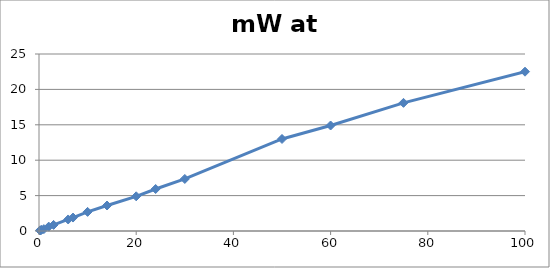
| Category | mW at sample |
|---|---|
| 0.2 | 0.077 |
| 0.3 | 0.103 |
| 0.5 | 0.155 |
| 1.0 | 0.266 |
| 2.0 | 0.614 |
| 3.0 | 0.86 |
| 6.0 | 1.63 |
| 7.0 | 1.9 |
| 10.0 | 2.7 |
| 14.0 | 3.6 |
| 20.0 | 4.9 |
| 24.0 | 5.93 |
| 30.0 | 7.35 |
| 50.0 | 13 |
| 60.0 | 14.9 |
| 75.0 | 18.1 |
| 100.0 | 22.5 |